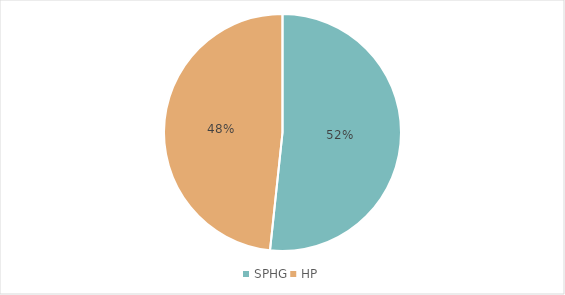
| Category | Nombre total de séjours |
|---|---|
| SPHG | 53093 |
| HP | 49636 |